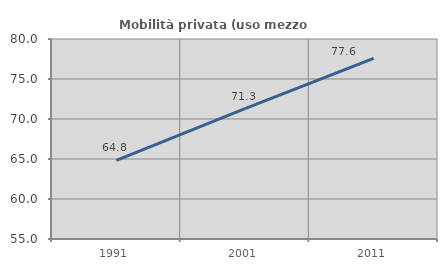
| Category | Mobilità privata (uso mezzo privato) |
|---|---|
| 1991.0 | 64.822 |
| 2001.0 | 71.304 |
| 2011.0 | 77.572 |